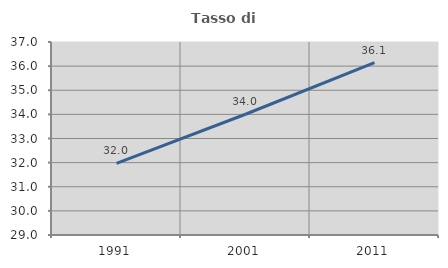
| Category | Tasso di occupazione   |
|---|---|
| 1991.0 | 31.97 |
| 2001.0 | 34.004 |
| 2011.0 | 36.147 |